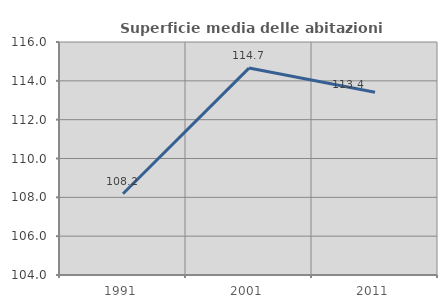
| Category | Superficie media delle abitazioni occupate |
|---|---|
| 1991.0 | 108.185 |
| 2001.0 | 114.656 |
| 2011.0 | 113.41 |